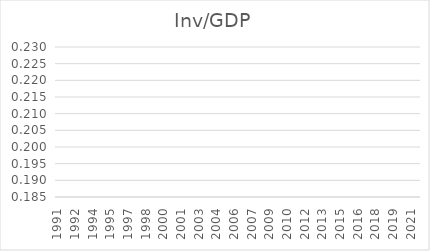
| Category | Inv/GDP |
|---|---|
| 1991.0 | 0 |
| 1991.0 | 0 |
| 1991.0 | 0 |
| 1991.0 | 0 |
| 1992.0 | 0 |
| 1992.0 | 0 |
| 1992.0 | 0 |
| 1992.0 | 0 |
| 1993.0 | 0 |
| 1993.0 | 0 |
| 1993.0 | 0 |
| 1993.0 | 0 |
| 1994.0 | 0 |
| 1994.0 | 0 |
| 1994.0 | 0 |
| 1994.0 | 0 |
| 1995.0 | 0 |
| 1995.0 | 0 |
| 1995.0 | 0 |
| 1995.0 | 0 |
| 1996.0 | 0 |
| 1996.0 | 0 |
| 1996.0 | 0 |
| 1996.0 | 0 |
| 1997.0 | 0 |
| 1997.0 | 0 |
| 1997.0 | 0 |
| 1997.0 | 0 |
| 1998.0 | 0 |
| 1998.0 | 0 |
| 1998.0 | 0 |
| 1998.0 | 0 |
| 1999.0 | 0 |
| 1999.0 | 0 |
| 1999.0 | 0 |
| 1999.0 | 0 |
| 2000.0 | 0 |
| 2000.0 | 0 |
| 2000.0 | 0 |
| 2000.0 | 0 |
| 2001.0 | 0 |
| 2001.0 | 0 |
| 2001.0 | 0 |
| 2001.0 | 0 |
| 2002.0 | 0 |
| 2002.0 | 0 |
| 2002.0 | 0 |
| 2002.0 | 0 |
| 2003.0 | 0 |
| 2003.0 | 0 |
| 2003.0 | 0 |
| 2003.0 | 0 |
| 2004.0 | 0 |
| 2004.0 | 0 |
| 2004.0 | 0 |
| 2004.0 | 0 |
| 2005.0 | 0 |
| 2005.0 | 0 |
| 2005.0 | 0 |
| 2005.0 | 0 |
| 2006.0 | 0 |
| 2006.0 | 0 |
| 2006.0 | 0 |
| 2006.0 | 0 |
| 2007.0 | 0 |
| 2007.0 | 0 |
| 2007.0 | 0 |
| 2007.0 | 0 |
| 2008.0 | 0 |
| 2008.0 | 0 |
| 2008.0 | 0 |
| 2008.0 | 0 |
| 2009.0 | 0 |
| 2009.0 | 0 |
| 2009.0 | 0 |
| 2009.0 | 0 |
| 2010.0 | 0 |
| 2010.0 | 0 |
| 2010.0 | 0 |
| 2010.0 | 0 |
| 2011.0 | 0 |
| 2011.0 | 0 |
| 2011.0 | 0 |
| 2011.0 | 0 |
| 2012.0 | 0 |
| 2012.0 | 0 |
| 2012.0 | 0 |
| 2012.0 | 0 |
| 2013.0 | 0 |
| 2013.0 | 0 |
| 2013.0 | 0 |
| 2013.0 | 0 |
| 2014.0 | 0 |
| 2014.0 | 0 |
| 2014.0 | 0 |
| 2014.0 | 0 |
| 2015.0 | 0 |
| 2015.0 | 0 |
| 2015.0 | 0 |
| 2015.0 | 0 |
| 2016.0 | 0 |
| 2016.0 | 0 |
| 2016.0 | 0 |
| 2016.0 | 0 |
| 2017.0 | 0 |
| 2017.0 | 0 |
| 2017.0 | 0 |
| 2017.0 | 0 |
| 2018.0 | 0 |
| 2018.0 | 0 |
| 2018.0 | 0 |
| 2018.0 | 0 |
| 2019.0 | 0 |
| 2019.0 | 0 |
| 2019.0 | 0 |
| 2019.0 | 0 |
| 2020.0 | 0 |
| 2020.0 | 0 |
| 2020.0 | 0 |
| 2020.0 | 0 |
| 2021.0 | 0 |
| 2021.0 | 0 |
| 2021.0 | 0 |
| 2021.0 | 0 |